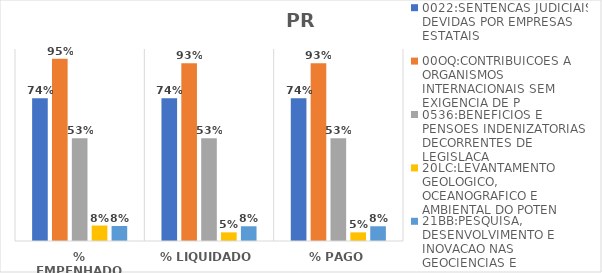
| Category | 0022:SENTENCAS JUDICIAIS DEVIDAS POR EMPRESAS ESTATAIS | 00OQ:CONTRIBUICOES A ORGANISMOS INTERNACIONAIS SEM EXIGENCIA DE P | 0536:BENEFICIOS E PENSOES INDENIZATORIAS DECORRENTES DE LEGISLACA | 20LC:LEVANTAMENTO GEOLOGICO, OCEANOGRAFICO E AMBIENTAL DO POTEN | 21BB:PESQUISA, DESENVOLVIMENTO E INOVACAO NAS GEOCIENCIAS E |
|---|---|---|---|---|---|
| % EMPENHADO | 0.744 | 0.95 | 0.535 | 0.08 | 0.078 |
| % LIQUIDADO | 0.744 | 0.926 | 0.535 | 0.045 | 0.077 |
| % PAGO | 0.744 | 0.926 | 0.535 | 0.045 | 0.077 |